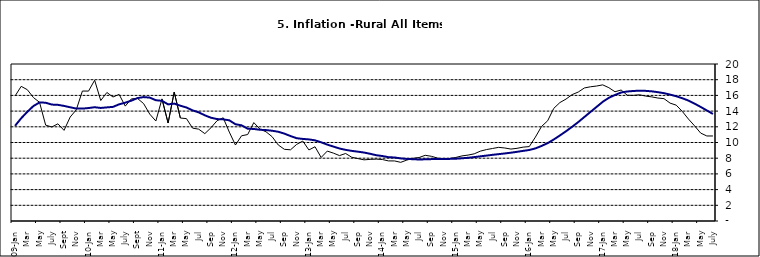
| Category | Series 0 | Series 1 |
|---|---|---|
| 09-Jan | 15.918 | 12.128 |
| Feb | 17.154 | 13.086 |
| Mar | 16.729 | 13.912 |
| Apr | 15.727 | 14.644 |
| May | 15.113 | 15.104 |
| June | 12.213 | 15.067 |
| July | 11.974 | 14.832 |
| Aug | 12.38 | 14.796 |
| Sept | 11.548 | 14.661 |
| Oct | 13.242 | 14.488 |
| Nov | 14.164 | 14.321 |
|  | 16.557 | 14.316 |
| 10-Jan | 16.548 | 14.39 |
| Feb | 17.934 | 14.494 |
| Mar | 15.346 | 14.401 |
| Apr | 16.373 | 14.473 |
| May | 15.794 | 14.54 |
| June | 16.126 | 14.862 |
| July | 14.634 | 15.072 |
| Aug | 15.556 | 15.33 |
| Sept | 15.616 | 15.658 |
| Oct | 14.955 | 15.786 |
| Nov | 13.616 | 15.719 |
| Dec | 12.735 | 15.385 |
| 11-Jan | 15.553 | 15.311 |
| Feb | 12.482 | 14.856 |
| Mar | 16.422 | 14.956 |
| Apr | 13.117 | 14.687 |
| May | 13.041 | 14.457 |
| Jun | 11.83 | 14.095 |
| Jul | 11.699 | 13.84 |
| Aug | 11.13 | 13.464 |
| Sep | 11.878 | 13.156 |
| Oct | 12.778 | 12.985 |
| Nov | 13.147 | 12.95 |
| Dec | 11.326 | 12.824 |
| 12-Jan | 9.678 | 12.33 |
| Feb | 10.856 | 12.188 |
| Mar | 11.014 | 11.76 |
| Apr | 12.536 | 11.724 |
| May | 11.712 | 11.621 |
| Jun | 11.36 | 11.582 |
| Jul | 10.733 | 11.499 |
| Aug | 9.683 | 11.368 |
| Sep | 9.132 | 11.131 |
| Oct | 9.071 | 10.82 |
| Nov | 9.758 | 10.548 |
| Dec | 10.183 | 10.455 |
| 13-Jan | 9.052 | 10.394 |
| Feb | 9.457 | 10.276 |
| Mar | 8.091 | 10.025 |
| Apr | 8.907 | 9.732 |
| May | 8.647 | 9.483 |
| Jun | 8.333 | 9.236 |
| Jul | 8.6 | 9.063 |
| Aug | 8.12 | 8.933 |
| Sep | 7.95 | 8.832 |
| Oct | 7.791 | 8.722 |
| Nov | 7.849 | 8.565 |
| Dec | 7.879 | 8.378 |
| 14-Jan | 7.832 | 8.277 |
| Feb | 7.657 | 8.13 |
| Mar | 7.65 | 8.092 |
| Apr | 7.473 | 7.973 |
| May | 7.761 | 7.901 |
| Jun | 7.98 | 7.874 |
| Jul | 8.086 | 7.834 |
| Aug | 8.368 | 7.858 |
| Sep | 8.244 | 7.883 |
| Oct | 8.019 | 7.903 |
| Nov | 7.898 | 7.906 |
| Dec | 7.955 | 7.913 |
| 15-Jan | 8.094 | 7.935 |
| Feb | 8.291 | 7.988 |
| Mar | 8.396 | 8.05 |
| Apr | 8.556 | 8.14 |
| May | 8.896 | 8.236 |
| Jun | 9.098 | 8.331 |
| Jul | 9.238 | 8.429 |
| Aug | 9.382 | 8.516 |
| Sep | 9.3 | 8.606 |
| Oct | 9.162 | 8.7 |
| Nov | 9.261 | 8.813 |
| Dec | 9.41 | 8.933 |
| 16-Jan | 9.48 | 9.047 |
| Feb | 10.692 | 9.249 |
| Mar | 12.038 | 9.559 |
| Apr | 12.767 | 9.917 |
| May | 14.349 | 10.384 |
| Jun | 15.088 | 10.897 |
| Jul | 15.533 | 11.433 |
| Aug | 16.103 | 12.002 |
| Sep | 16.428 | 12.601 |
| Oct | 16.947 | 13.25 |
| Nov | 17.099 | 13.898 |
| Dec | 17.195 | 14.54 |
| 17-Jan | 17.341 | 15.183 |
| Feb | 16.982 | 15.696 |
| Mar | 16.466 | 16.054 |
| Apr | 16.687 | 16.369 |
| May | 16.023 | 16.497 |
| Jun | 16.007 | 16.563 |
| Jul | 16.078 | 16.6 |
| Aug | 15.914 | 16.577 |
| Sep | 15.812 | 16.52 |
| Oct | 15.666 | 16.411 |
| Nov | 15.587 | 16.285 |
| Dec | 15.018 | 16.104 |
| 18-Jan | 14.756 | 15.892 |
| Feb | 13.957 | 15.638 |
| Mar | 12.987 | 15.339 |
| Apr | 12.126 | 14.95 |
| May | 11.199 | 14.53 |
| June | 10.832 | 14.083 |
| July | 10.831 | 13.636 |